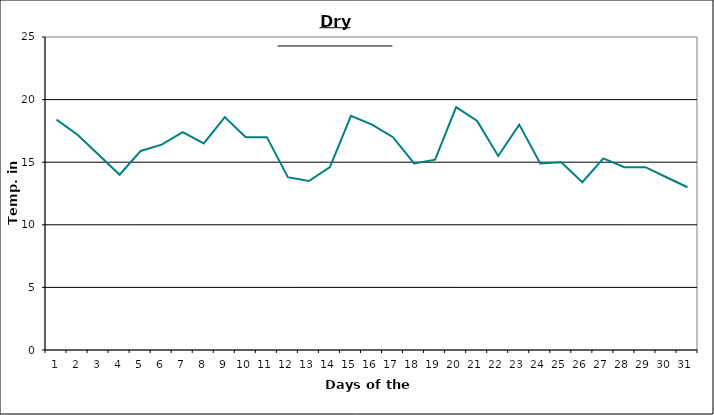
| Category | Series 0 |
|---|---|
| 0 | 18.4 |
| 1 | 17.2 |
| 2 | 15.6 |
| 3 | 14 |
| 4 | 15.9 |
| 5 | 16.4 |
| 6 | 17.4 |
| 7 | 16.5 |
| 8 | 18.6 |
| 9 | 17 |
| 10 | 17 |
| 11 | 13.8 |
| 12 | 13.5 |
| 13 | 14.6 |
| 14 | 18.7 |
| 15 | 18 |
| 16 | 17 |
| 17 | 14.9 |
| 18 | 15.2 |
| 19 | 19.4 |
| 20 | 18.3 |
| 21 | 15.5 |
| 22 | 18 |
| 23 | 14.9 |
| 24 | 15 |
| 25 | 13.4 |
| 26 | 15.3 |
| 27 | 14.6 |
| 28 | 14.6 |
| 29 | 13.8 |
| 30 | 13 |